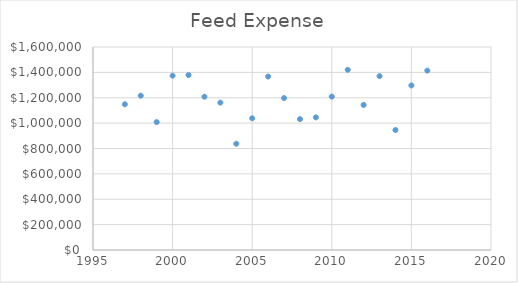
| Category | Series 0 |
|---|---|
| 1997.0 | 1148506 |
| 1998.0 | 1216304.25 |
| 1999.0 | 1008175.75 |
| 2000.0 | 1373958.34 |
| 2001.0 | 1378872.65 |
| 2002.0 | 1208090.75 |
| 2003.0 | 1161695.6 |
| 2004.0 | 837363.63 |
| 2005.0 | 1038244.44 |
| 2006.0 | 1367257.85 |
| 2007.0 | 1197482.68 |
| 2008.0 | 1031553.74 |
| 2009.0 | 1045262.61 |
| 2010.0 | 1209200.36 |
| 2011.0 | 1420051.47 |
| 2012.0 | 1143224.51 |
| 2013.0 | 1370224.84 |
| 2014.0 | 945755.75 |
| 2015.0 | 1297195.94 |
| 2016.0 | 1413738.46 |